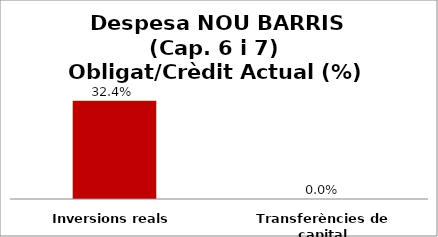
| Category | Series 0 |
|---|---|
| Inversions reals | 0.324 |
| Transferències de capital | 0 |